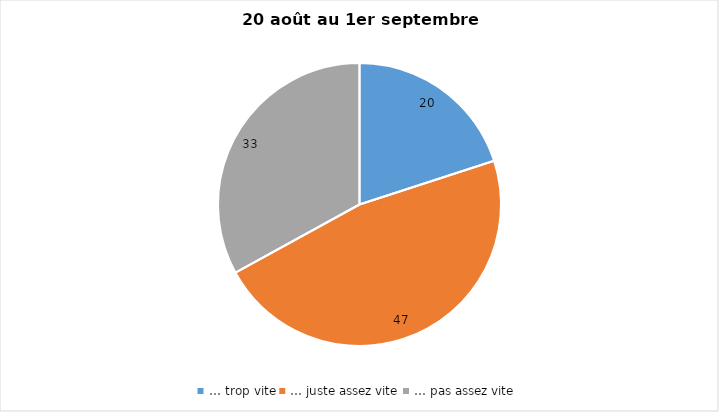
| Category | Series 0 |
|---|---|
| … trop vite | 20 |
| … juste assez vite | 47 |
| … pas assez vite | 33 |